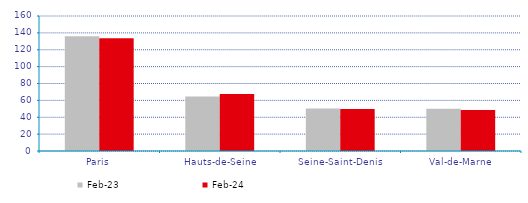
| Category | févr-23 | févr-24 |
|---|---|---|
| Paris | 136.144 | 133.573 |
| Hauts-de-Seine | 64.448 | 67.704 |
| Seine-Saint-Denis | 50.275 | 49.811 |
| Val-de-Marne | 50.036 | 48.739 |